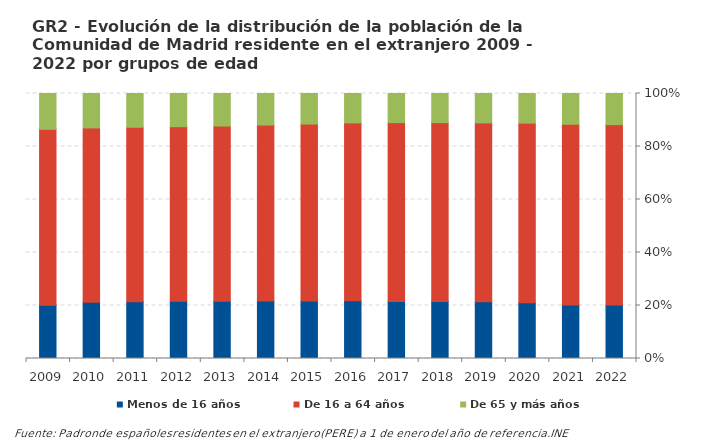
| Category | Menos de 16 años | De 16 a 64 años | De 65 y más años |
|---|---|---|---|
| 2022.0 | 91002 | 307016 | 53014 |
| 2021.0 | 86344 | 291209 | 49535 |
| 2020.0 | 88179 | 283620 | 46891 |
| 2019.0 | 85579 | 270098 | 44460 |
| 2018.0 | 82932 | 260137 | 42403 |
| 2017.0 | 79206 | 247837 | 40391 |
| 2016.0 | 75191 | 231117 | 38239 |
| 2015.0 | 69100 | 212181 | 36616 |
| 2014.0 | 63619 | 194438 | 34901 |
| 2013.0 | 57965 | 177348 | 32931 |
| 2012.0 | 53916 | 164680 | 31311 |
| 2011.0 | 49937 | 153254 | 29667 |
| 2010.0 | 45821 | 141638 | 27997 |
| 2009.0 | 39708 | 131154 | 26683 |